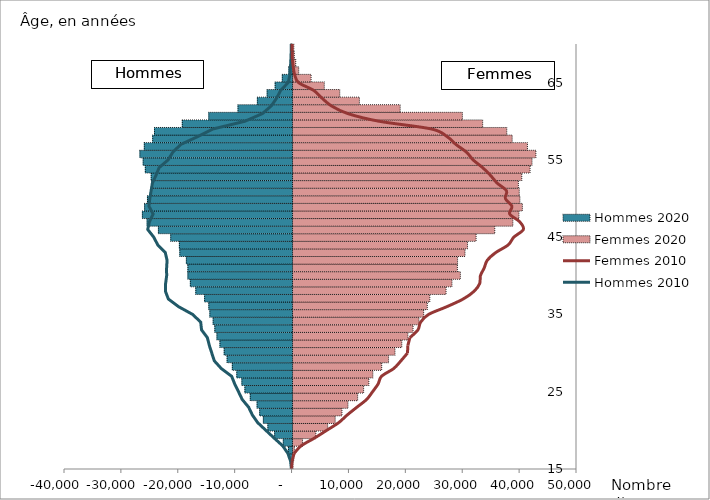
| Category | Femmes 2020 | Hommes 2020 |
|---|---|---|
| 15.0 | 51 | -168 |
| 16.0 | 200 | -429 |
| 17.0 | 328 | -633 |
| 18.0 | 1756 | -1535 |
| 19.0 | 4096 | -3060 |
| 20.0 | 6176 | -4247 |
| 21.0 | 7495 | -5038 |
| 22.0 | 8686 | -5685 |
| 23.0 | 9741 | -6139 |
| 24.0 | 11444 | -7338 |
| 25.0 | 12498 | -8284 |
| 26.0 | 13415 | -8815 |
| 27.0 | 14118 | -9707 |
| 28.0 | 15672 | -10495 |
| 29.0 | 16878 | -11409 |
| 30.0 | 18007 | -11924 |
| 31.0 | 19205 | -12667 |
| 32.0 | 20276 | -13194 |
| 33.0 | 21183 | -13567 |
| 34.0 | 22224 | -13863 |
| 35.0 | 23049 | -14442 |
| 36.0 | 23684 | -14625 |
| 37.0 | 24132 | -15369 |
| 38.0 | 26984 | -16915 |
| 39.0 | 28023 | -17873 |
| 40.0 | 29497 | -18304 |
| 41.0 | 28974 | -18303 |
| 42.0 | 29006 | -18573 |
| 43.0 | 30313 | -19724 |
| 44.0 | 30755 | -19804 |
| 45.0 | 32266 | -21322 |
| 46.0 | 35550 | -23490 |
| 47.0 | 38728 | -25476 |
| 48.0 | 39799 | -26303 |
| 49.0 | 40399 | -25919 |
| 50.0 | 39965 | -25415 |
| 51.0 | 39849 | -24833 |
| 52.0 | 39697 | -24663 |
| 53.0 | 40294 | -24755 |
| 54.0 | 41751 | -25787 |
| 55.0 | 42095 | -26164 |
| 56.0 | 42776 | -26737 |
| 57.0 | 41286 | -25965 |
| 58.0 | 38607 | -24493 |
| 59.0 | 37659 | -24180 |
| 60.0 | 33420 | -19290 |
| 61.0 | 29854 | -14630 |
| 62.0 | 18920 | -9495 |
| 63.0 | 11752 | -6091 |
| 64.0 | 8302 | -4374 |
| 65.0 | 5579 | -2964 |
| 66.0 | 3260 | -1708 |
| 67.0 | 1088 | -554 |
| 68.0 | 560 | -282 |
| 69.0 | 306 | -201 |
| 70.0 | 228 | -177 |